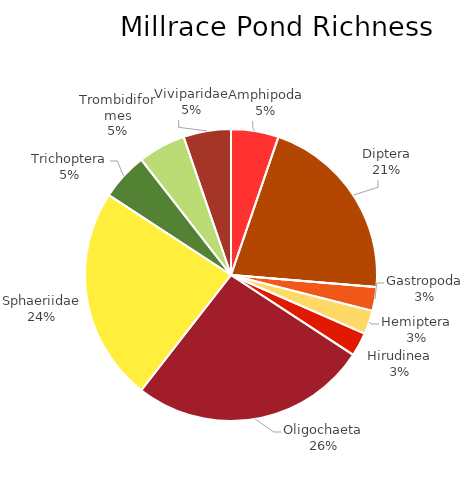
| Category | millrace pond | river pond |
|---|---|---|
| Amphipoda | 2 | 3 |
| Diptera | 8 | 4 |
| Ephemeroptera | 0 | 9 |
| Gastropoda | 1 | 0 |
| Hemiptera | 1 | 0 |
| Hirudinea | 1 | 0 |
| Oligochaeta | 10 | 34 |
| Sphaeriidae | 9 | 0 |
| Trichoptera | 2 | 0 |
| Trombidiformes | 2 | 1 |
| Viviparidae | 2 | 0 |